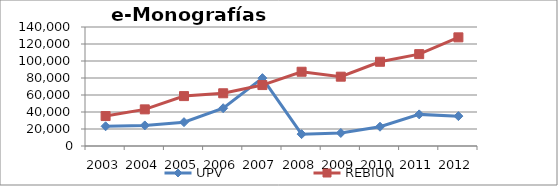
| Category | UPV | REBIUN |
|---|---|---|
| 2003 | 23200 | 35235.8 |
| 2004 | 24200 | 43096.244 |
| 2005 | 28041 | 58702.143 |
| 2006 | 44457 | 62032.444 |
| 2007 | 79839 | 71687.936 |
| 2008 | 13966 | 87368.25 |
| 2009 | 15332 | 81558.51 |
| 2010 | 22668 | 99102.571 |
| 2011 | 37201 | 108084 |
| 2012 | 35144 | 127829 |